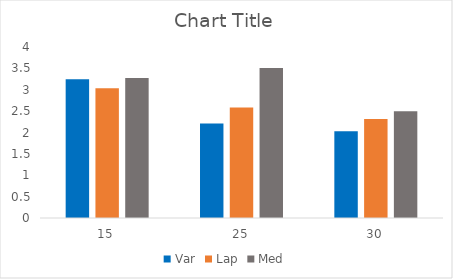
| Category | Var | Lap | Med |
|---|---|---|---|
| 15.0 | 3.246 | 3.034 | 3.276 |
| 25.0 | 2.209 | 2.586 | 3.511 |
| 30.0 | 2.032 | 2.317 | 2.499 |